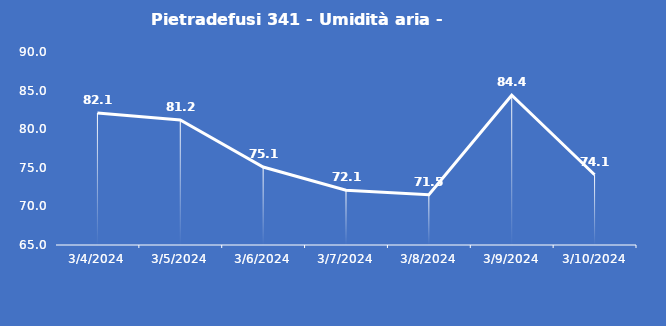
| Category | Pietradefusi 341 - Umidità aria - Grezzo (%) |
|---|---|
| 3/4/24 | 82.1 |
| 3/5/24 | 81.2 |
| 3/6/24 | 75.1 |
| 3/7/24 | 72.1 |
| 3/8/24 | 71.5 |
| 3/9/24 | 84.4 |
| 3/10/24 | 74.1 |